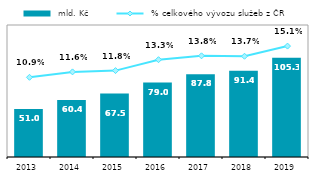
| Category |  mld. Kč |
|---|---|
| 2013.0 | 51.021 |
| 2014.0 | 60.444 |
| 2015.0 | 67.463 |
| 2016.0 | 79.004 |
| 2017.0 | 87.808 |
| 2018.0 | 91.441 |
| 2019.0 | 105.286 |